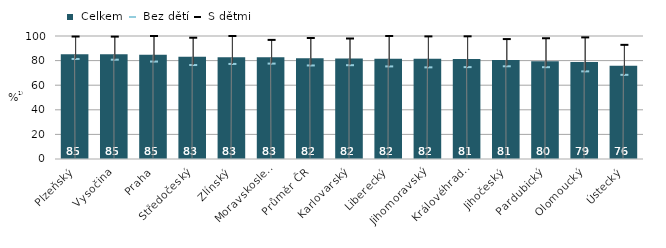
| Category |  Celkem |
|---|---|
|   Plzeňský | 85.234 |
|   Vysočina | 85.134 |
|   Praha | 84.685 |
|   Středočeský | 83.065 |
|   Zlínský | 82.801 |
|   Moravskoslezský | 82.757 |
| Průměr ČR | 81.941 |
|   Karlovarský | 81.781 |
|   Liberecký | 81.545 |
|   Jihomoravský | 81.501 |
|   Královéhradecký | 81.306 |
|   Jihočeský | 80.521 |
|   Pardubický | 79.546 |
|   Olomoucký | 78.848 |
|   Ústecký | 75.843 |